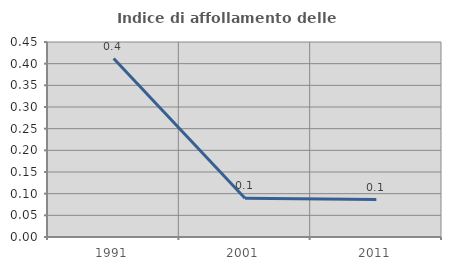
| Category | Indice di affollamento delle abitazioni  |
|---|---|
| 1991.0 | 0.412 |
| 2001.0 | 0.089 |
| 2011.0 | 0.086 |